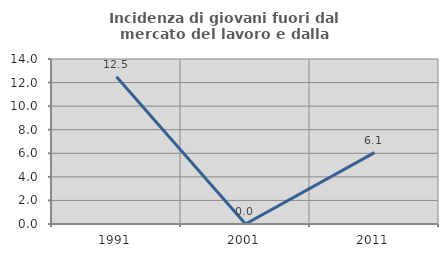
| Category | Incidenza di giovani fuori dal mercato del lavoro e dalla formazione  |
|---|---|
| 1991.0 | 12.5 |
| 2001.0 | 0 |
| 2011.0 | 6.061 |